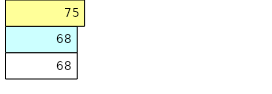
| Category | Total Standouts | Total Recd | Total Tipsters |
|---|---|---|---|
| 0 | 68 | 68 | 75 |